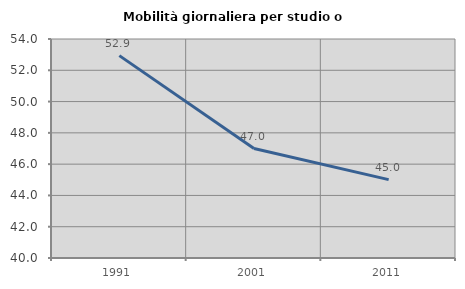
| Category | Mobilità giornaliera per studio o lavoro |
|---|---|
| 1991.0 | 52.938 |
| 2001.0 | 46.997 |
| 2011.0 | 45.012 |